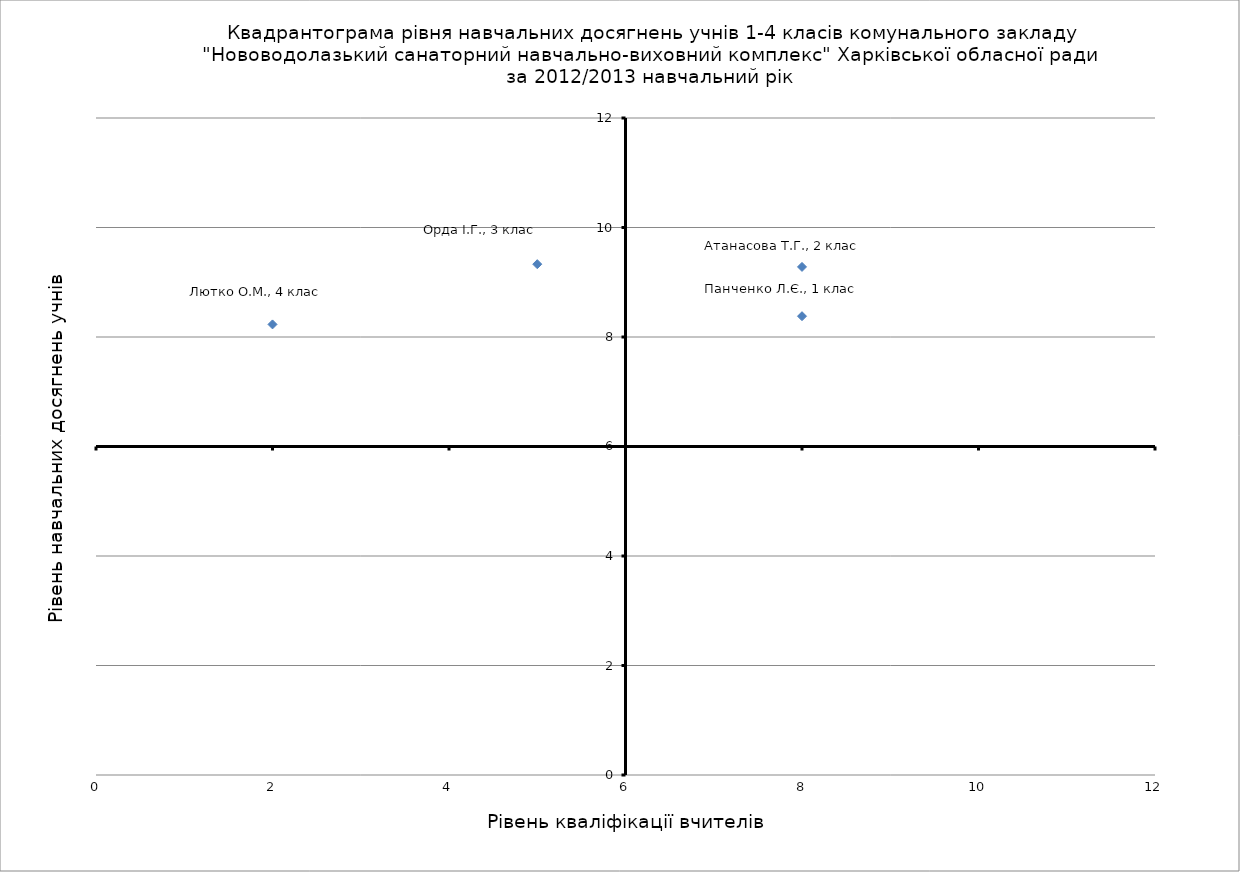
| Category | Рівень навчальних досягнень учнів |
|---|---|
| 8.0 | 8.38 |
| 8.0 | 9.28 |
| 5.0 | 9.33 |
| 2.0 | 8.23 |